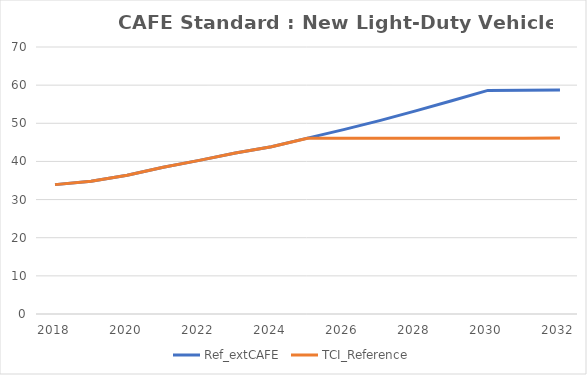
| Category | Ref_extCAFE | TCI_Reference |
|---|---|---|
| 2018.0 | 33.918 | 33.918 |
| 2019.0 | 34.814 | 34.813 |
| 2020.0 | 36.367 | 36.367 |
| 2021.0 | 38.467 | 38.467 |
| 2022.0 | 40.27 | 40.27 |
| 2023.0 | 42.227 | 42.229 |
| 2024.0 | 43.838 | 43.827 |
| 2025.0 | 46.111 | 46.095 |
| 2026.0 | 48.333 | 46.057 |
| 2027.0 | 50.707 | 46.065 |
| 2028.0 | 53.266 | 46.069 |
| 2029.0 | 55.894 | 46.06 |
| 2030.0 | 58.622 | 46.044 |
| 2031.0 | 58.664 | 46.063 |
| 2032.0 | 58.754 | 46.127 |